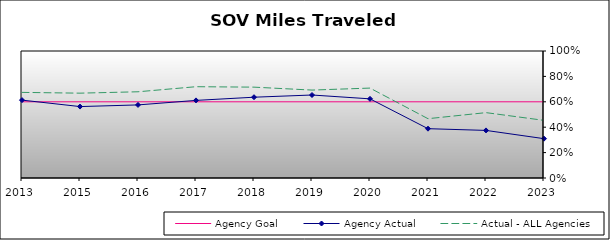
| Category | Agency Goal | Agency Actual | Actual - ALL Agencies |
|---|---|---|---|
| 2013.0 | 0.6 | 0.613 | 0.674 |
| 2015.0 | 0.6 | 0.562 | 0.668 |
| 2016.0 | 0.6 | 0.576 | 0.679 |
| 2017.0 | 0.6 | 0.611 | 0.719 |
| 2018.0 | 0.6 | 0.636 | 0.715 |
| 2019.0 | 0.6 | 0.654 | 0.692 |
| 2020.0 | 0.6 | 0.623 | 0.708 |
| 2021.0 | 0.6 | 0.388 | 0.467 |
| 2022.0 | 0.6 | 0.375 | 0.515 |
| 2023.0 | 0.6 | 0.31 | 0.454 |